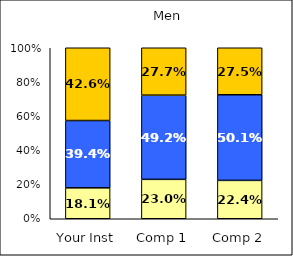
| Category | Low Leadership | Average Leadership | High Leadership |
|---|---|---|---|
| Your Inst | 0.181 | 0.394 | 0.426 |
| Comp 1 | 0.23 | 0.492 | 0.277 |
| Comp 2 | 0.224 | 0.501 | 0.275 |